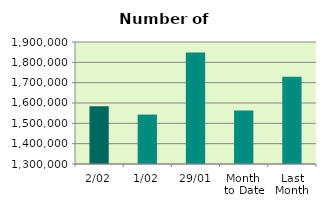
| Category | Series 0 |
|---|---|
| 2/02 | 1584146 |
| 1/02 | 1542990 |
| 29/01 | 1848916 |
| Month 
to Date | 1563568 |
| Last
Month | 1728874.4 |